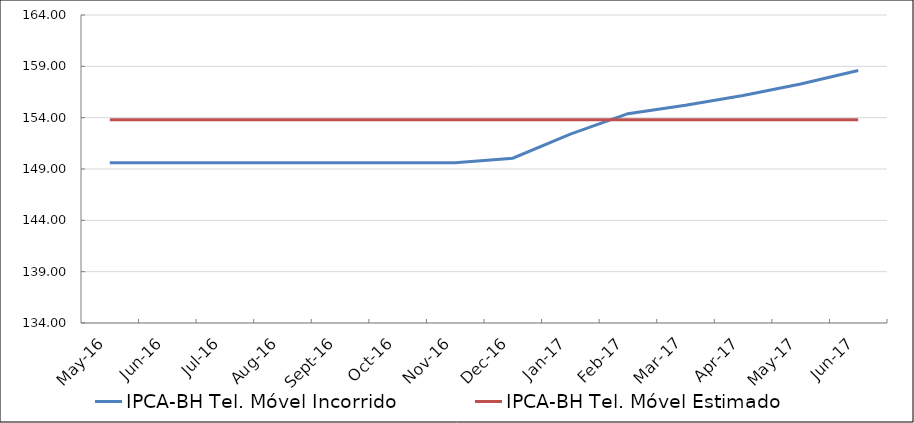
| Category | IPCA-BH Tel. Móvel Incorrido | IPCA-BH Tel. Móvel Estimado |
|---|---|---|
| 2016-05-01 | 149.619 | 153.786 |
| 2016-06-01 | 149.619 | 153.786 |
| 2016-07-01 | 149.619 | 153.786 |
| 2016-08-01 | 149.619 | 153.786 |
| 2016-09-01 | 149.619 | 153.786 |
| 2016-10-01 | 149.619 | 153.786 |
| 2016-11-01 | 149.619 | 153.786 |
| 2016-12-01 | 150.053 | 153.786 |
| 2017-01-01 | 152.394 | 153.786 |
| 2017-02-01 | 154.39 | 153.786 |
| 2017-03-01 | 155.203 | 153.786 |
| 2017-04-01 | 156.157 | 153.786 |
| 2017-05-01 | 157.277 | 153.786 |
| 2017-06-01 | 158.592 | 153.786 |